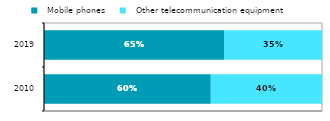
| Category |   Mobile phones |   Other telecommunication equipment |
|---|---|---|
| 2010.0 | 0.6 | 0.4 |
| 2019.0 | 0.648 | 0.352 |